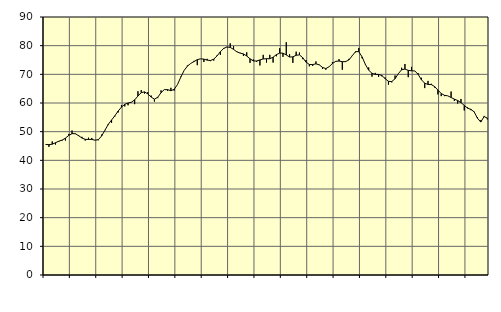
| Category | Piggar | Series 1 |
|---|---|---|
| nan | 45.5 | 45.55 |
| 87.0 | 44.7 | 45.47 |
| 87.0 | 46.6 | 45.63 |
| 87.0 | 45.5 | 46.15 |
| nan | 46.5 | 46.67 |
| 88.0 | 46.9 | 47.06 |
| 88.0 | 46.9 | 47.72 |
| 88.0 | 49.2 | 48.69 |
| nan | 50.4 | 49.32 |
| 89.0 | 49.4 | 49.28 |
| 89.0 | 48.8 | 48.59 |
| 89.0 | 48.2 | 47.78 |
| nan | 46.9 | 47.32 |
| 90.0 | 47.9 | 47.29 |
| 90.0 | 47.8 | 47.3 |
| 90.0 | 47 | 47.02 |
| nan | 47 | 47.22 |
| 91.0 | 49 | 48.52 |
| 91.0 | 50.6 | 50.51 |
| 91.0 | 52.3 | 52.54 |
| nan | 53.1 | 54.08 |
| 92.0 | 55.3 | 55.55 |
| 92.0 | 56.7 | 57.19 |
| 92.0 | 59.3 | 58.56 |
| nan | 58.8 | 59.55 |
| 93.0 | 59.2 | 60 |
| 93.0 | 60.2 | 60.27 |
| 93.0 | 59.6 | 61.09 |
| nan | 64.1 | 62.43 |
| 94.0 | 64.5 | 63.61 |
| 94.0 | 63.3 | 63.88 |
| 94.0 | 63.8 | 63.16 |
| nan | 62.6 | 62.07 |
| 95.0 | 60.5 | 61.34 |
| 95.0 | 61.7 | 62 |
| 95.0 | 64.4 | 63.6 |
| nan | 64.7 | 64.67 |
| 96.0 | 64.2 | 64.66 |
| 96.0 | 65.3 | 64.29 |
| 96.0 | 64.3 | 64.79 |
| nan | 66.5 | 66.45 |
| 97.0 | 69.2 | 69.02 |
| 97.0 | 71.3 | 71.32 |
| 97.0 | 73.1 | 72.86 |
| nan | 73.8 | 73.79 |
| 98.0 | 74.7 | 74.46 |
| 98.0 | 73.2 | 75.12 |
| 98.0 | 75.4 | 75.4 |
| nan | 74.3 | 75.31 |
| 99.0 | 75.4 | 74.95 |
| 99.0 | 74.6 | 74.82 |
| 99.0 | 74.8 | 75.31 |
| nan | 76.6 | 76.42 |
| 0.0 | 76.8 | 77.88 |
| 0.0 | 79.2 | 79.02 |
| 0.0 | 79.6 | 79.53 |
| nan | 80.8 | 79.4 |
| 1.0 | 79.8 | 78.71 |
| 1.0 | 78 | 77.85 |
| 1.0 | 77.5 | 77.41 |
| nan | 76.4 | 77.12 |
| 2.0 | 77.7 | 76.4 |
| 2.0 | 74 | 75.42 |
| 2.0 | 75.2 | 74.67 |
| nan | 74.3 | 74.66 |
| 3.0 | 73.1 | 75.03 |
| 3.0 | 76.8 | 75.36 |
| 3.0 | 74.1 | 75.46 |
| nan | 76.8 | 75.44 |
| 4.0 | 74.1 | 75.99 |
| 4.0 | 76.3 | 76.87 |
| 4.0 | 79.1 | 77.4 |
| nan | 76.1 | 77.39 |
| 5.0 | 81.2 | 76.76 |
| 5.0 | 77 | 76.04 |
| 5.0 | 74 | 76.1 |
| nan | 77.9 | 76.65 |
| 6.0 | 77.6 | 76.78 |
| 6.0 | 75.3 | 75.78 |
| 6.0 | 75 | 74.25 |
| nan | 72.8 | 73.42 |
| 7.0 | 72.9 | 73.4 |
| 7.0 | 74.5 | 73.66 |
| 7.0 | 73.4 | 73.3 |
| nan | 71.9 | 72.41 |
| 8.0 | 71.6 | 72.01 |
| 8.0 | 72.7 | 72.65 |
| 8.0 | 74.3 | 73.78 |
| nan | 74.4 | 74.53 |
| 9.0 | 75.3 | 74.63 |
| 9.0 | 71.6 | 74.42 |
| 9.0 | 74.6 | 74.44 |
| nan | 75.4 | 75.03 |
| 10.0 | 76.4 | 76.47 |
| 10.0 | 77.7 | 77.9 |
| 10.0 | 79.2 | 77.93 |
| nan | 75.6 | 76.07 |
| 11.0 | 73.6 | 73.46 |
| 11.0 | 72.4 | 71.44 |
| 11.0 | 69.2 | 70.37 |
| nan | 70.5 | 69.97 |
| 12.0 | 69.1 | 69.96 |
| 12.0 | 69.3 | 69.6 |
| 12.0 | 68.9 | 68.48 |
| nan | 66.4 | 67.55 |
| 13.0 | 67.2 | 67.48 |
| 13.0 | 69.6 | 68.47 |
| 13.0 | 70.2 | 70.24 |
| nan | 72.3 | 71.6 |
| 14.0 | 73.6 | 71.84 |
| 14.0 | 69 | 71.38 |
| 14.0 | 72.6 | 71.23 |
| nan | 71.2 | 71.19 |
| 15.0 | 70.4 | 69.99 |
| 15.0 | 68.8 | 68.1 |
| 15.0 | 65.2 | 66.89 |
| nan | 67.7 | 66.49 |
| 16.0 | 66.7 | 66.43 |
| 16.0 | 65.4 | 65.73 |
| 16.0 | 63 | 64.5 |
| nan | 62.4 | 63.32 |
| 17.0 | 62.4 | 62.66 |
| 17.0 | 62.5 | 62.5 |
| 17.0 | 64 | 61.92 |
| nan | 60.7 | 61.35 |
| 18.0 | 59.8 | 60.86 |
| 18.0 | 61.4 | 60.13 |
| 18.0 | 57.4 | 59.16 |
| nan | 58.5 | 58.21 |
| 19.0 | 57.5 | 57.78 |
| 19.0 | 57 | 56.9 |
| 19.0 | 55.1 | 54.68 |
| nan | 54 | 53.35 |
| 20.0 | 55.5 | 55.26 |
| 20.0 | 54.3 | 54.74 |